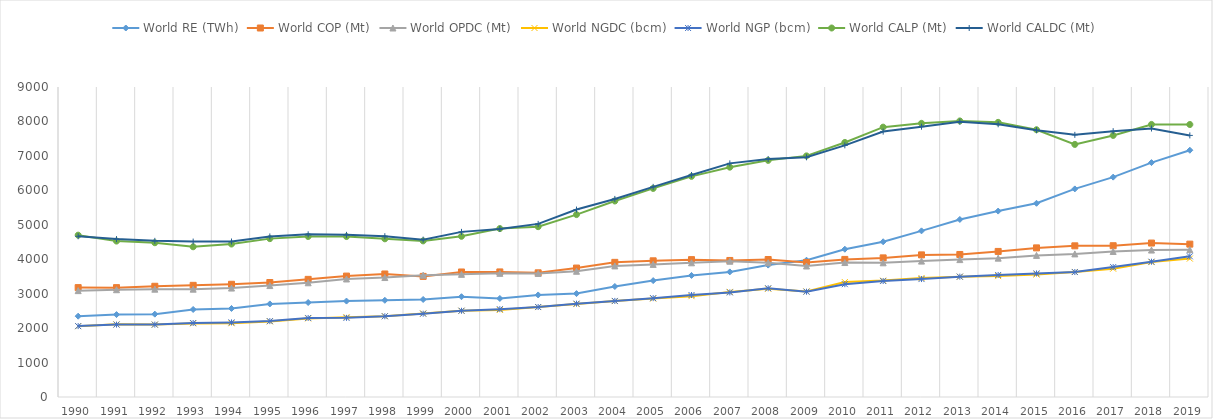
| Category | World RE (TWh) | World COP (Mt) | World OPDC (Mt) | World NGDC (bcm) | World NGP (bcm) | World CALP (Mt) | World CALDC (Mt) |
|---|---|---|---|---|---|---|---|
| 1990.0 | 2346.57 | 3175.493 | 3088.06 | 2055.925 | 2058.37 | 4698.291 | 4666.162 |
| 1991.0 | 2392.847 | 3175.056 | 3114.916 | 2108.769 | 2101.823 | 4526.833 | 4584.254 |
| 1992.0 | 2405.147 | 3214.734 | 3130.218 | 2101.908 | 2101.996 | 4478.842 | 4532.863 |
| 1993.0 | 2540.931 | 3241.999 | 3130.278 | 2137.046 | 2148.073 | 4361.455 | 4512.159 |
| 1994.0 | 2569.971 | 3272.242 | 3162.503 | 2142.229 | 2165.958 | 4441.442 | 4514.487 |
| 1995.0 | 2702.009 | 3324.165 | 3235.069 | 2195.234 | 2203.335 | 4597.944 | 4660.706 |
| 1996.0 | 2743.439 | 3415.158 | 3315.76 | 2280.886 | 2294.424 | 4660.917 | 4723.45 |
| 1997.0 | 2784.937 | 3510.497 | 3426.315 | 2317.829 | 2297.257 | 4658.418 | 4707.61 |
| 1998.0 | 2807.735 | 3571.833 | 3468.379 | 2345.991 | 2344.268 | 4592.791 | 4668.359 |
| 1999.0 | 2831.489 | 3501.734 | 3537.371 | 2425.404 | 2417.976 | 4532.048 | 4568.669 |
| 2000.0 | 2911.606 | 3629.715 | 3560.741 | 2503.768 | 2503.77 | 4665.177 | 4793.89 |
| 2001.0 | 2860.859 | 3630.877 | 3589.238 | 2527.549 | 2550.116 | 4889.849 | 4879.061 |
| 2002.0 | 2962.763 | 3605.331 | 3587.474 | 2610.329 | 2612.597 | 4945.292 | 5025.882 |
| 2003.0 | 3002.105 | 3743.557 | 3650.408 | 2697.291 | 2710.23 | 5295.844 | 5441.443 |
| 2004.0 | 3208.953 | 3909.003 | 3805.729 | 2784.118 | 2789.603 | 5691.128 | 5750.29 |
| 2005.0 | 3379.138 | 3953.672 | 3849.599 | 2858.244 | 2870.14 | 6055.836 | 6100.685 |
| 2006.0 | 3529.155 | 3988.211 | 3896.133 | 2927.336 | 2960.867 | 6405.391 | 6445.716 |
| 2007.0 | 3632.121 | 3963.889 | 3941.209 | 3051.705 | 3035.799 | 6672.877 | 6782.824 |
| 2008.0 | 3829.438 | 3991.561 | 3896.737 | 3141.982 | 3157.402 | 6870.387 | 6909.991 |
| 2009.0 | 3971.037 | 3906.603 | 3802.827 | 3065.288 | 3057.1 | 7000.111 | 6958.773 |
| 2010.0 | 4290.734 | 3994.476 | 3903.58 | 3335.544 | 3276.108 | 7389.33 | 7306.01 |
| 2011.0 | 4506.66 | 4038.882 | 3895.99 | 3379.337 | 3366.988 | 7834.563 | 7705.516 |
| 2012.0 | 4823.804 | 4125.961 | 3945.166 | 3453.16 | 3424.024 | 7944.986 | 7847.975 |
| 2013.0 | 5154.352 | 4137.809 | 3988.91 | 3492.394 | 3494.038 | 8014.339 | 7991.489 |
| 2014.0 | 5397.657 | 4226.078 | 4031.723 | 3510.165 | 3542.128 | 7973.336 | 7918.417 |
| 2015.0 | 5623.651 | 4329.23 | 4111.297 | 3555.27 | 3587.964 | 7759.76 | 7745.082 |
| 2016.0 | 6041.321 | 4388.82 | 4154.695 | 3630.55 | 3627.676 | 7333.377 | 7610.549 |
| 2017.0 | 6383.186 | 4391.747 | 4225.094 | 3725.075 | 3771.476 | 7594.62 | 7717.161 |
| 2018.0 | 6805.78 | 4469.321 | 4266.046 | 3916.886 | 3927.535 | 7913.635 | 7794.857 |
| 2019.0 | 7164.358 | 4437.975 | 4277.075 | 4018.309 | 4084.566 | 7910.999 | 7594.599 |